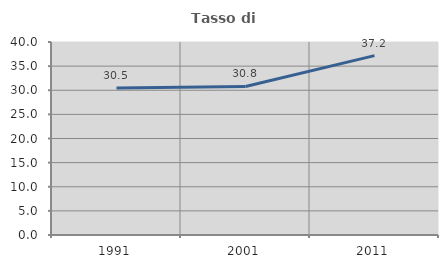
| Category | Tasso di occupazione   |
|---|---|
| 1991.0 | 30.45 |
| 2001.0 | 30.782 |
| 2011.0 | 37.175 |